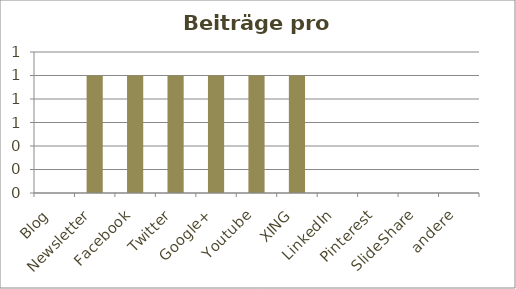
| Category | Beiträge |
|---|---|
| Blog | 0 |
| Newsletter | 1 |
| Facebook | 1 |
| Twitter | 1 |
| Google+ | 1 |
| Youtube | 1 |
| XING | 1 |
| LinkedIn | 0 |
| Pinterest | 0 |
| SlideShare | 0 |
| andere | 0 |